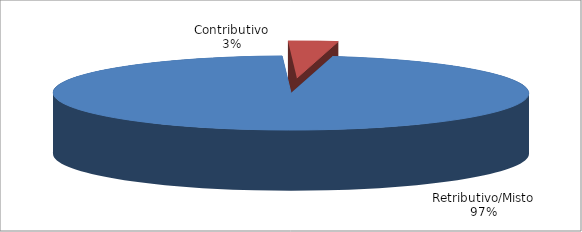
| Category | Series 1 |
|---|---|
| Retributivo/Misto | 30672 |
| Contributivo | 1071 |